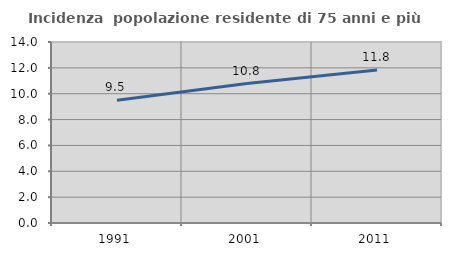
| Category | Incidenza  popolazione residente di 75 anni e più |
|---|---|
| 1991.0 | 9.495 |
| 2001.0 | 10.782 |
| 2011.0 | 11.836 |